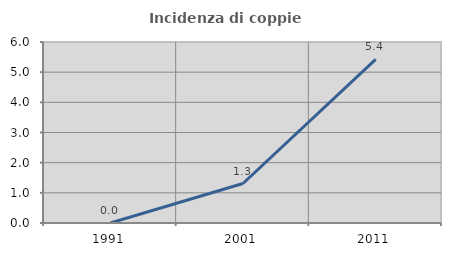
| Category | Incidenza di coppie miste |
|---|---|
| 1991.0 | 0 |
| 2001.0 | 1.309 |
| 2011.0 | 5.425 |